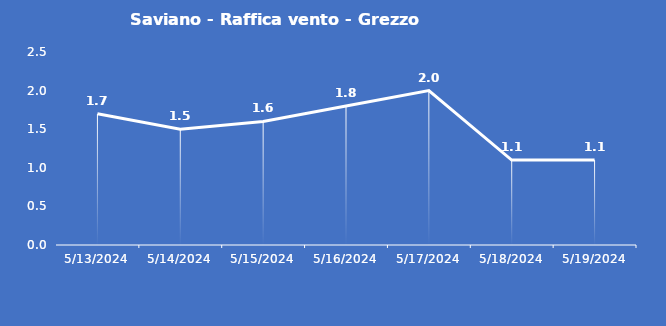
| Category | Saviano - Raffica vento - Grezzo (m/s) |
|---|---|
| 5/13/24 | 1.7 |
| 5/14/24 | 1.5 |
| 5/15/24 | 1.6 |
| 5/16/24 | 1.8 |
| 5/17/24 | 2 |
| 5/18/24 | 1.1 |
| 5/19/24 | 1.1 |